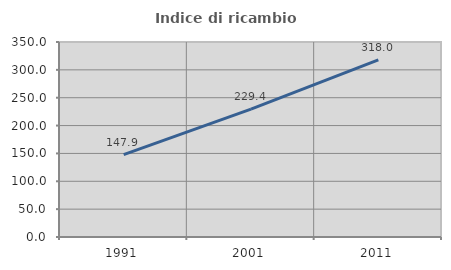
| Category | Indice di ricambio occupazionale  |
|---|---|
| 1991.0 | 147.934 |
| 2001.0 | 229.412 |
| 2011.0 | 318 |